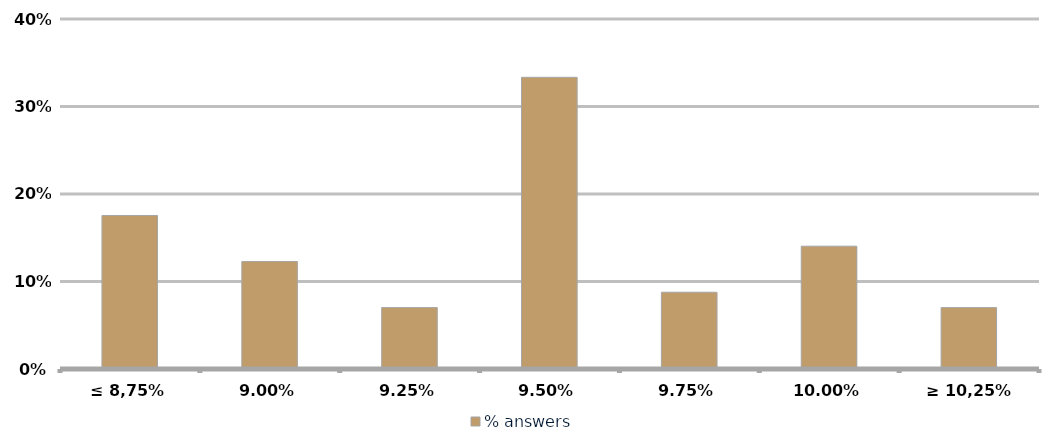
| Category | % answers |
|---|---|
| ≤ 8,75% | 0.175 |
| 9,00% | 0.123 |
| 9,25% | 0.07 |
| 9,50% | 0.333 |
| 9,75% | 0.088 |
| 10,00% | 0.14 |
| ≥ 10,25% | 0.07 |